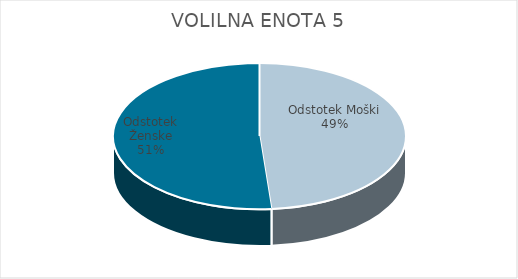
| Category | VOLILNA ENOTA 5 | #REF! | Slovenija skupaj |
|---|---|---|---|
| Odstotek Moški | 34.25 |  | 33.67 |
| Odstotek Ženske | 36.07 |  | 35.97 |